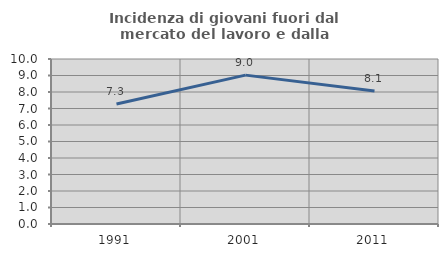
| Category | Incidenza di giovani fuori dal mercato del lavoro e dalla formazione  |
|---|---|
| 1991.0 | 7.273 |
| 2001.0 | 9.022 |
| 2011.0 | 8.058 |